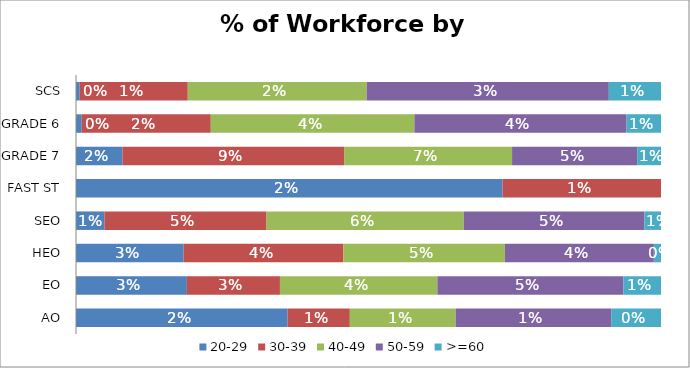
| Category | 20-29 | 30-39 | 40-49 | 50-59 | >=60 |
|---|---|---|---|---|---|
| AO | 0.017 | 0.005 | 0.009 | 0.013 | 0.004 |
| EO | 0.031 | 0.026 | 0.044 | 0.052 | 0.011 |
| HEO | 0.03 | 0.045 | 0.045 | 0.042 | 0.002 |
| SEO | 0.009 | 0.049 | 0.059 | 0.054 | 0.005 |
| FAST ST | 0.018 | 0.007 | 0 | 0 | 0 |
| GRADE 7 | 0.02 | 0.093 | 0.071 | 0.053 | 0.01 |
| GRADE 6 | 0.001 | 0.023 | 0.036 | 0.037 | 0.006 |
| SCS | 0.001 | 0.015 | 0.024 | 0.033 | 0.007 |